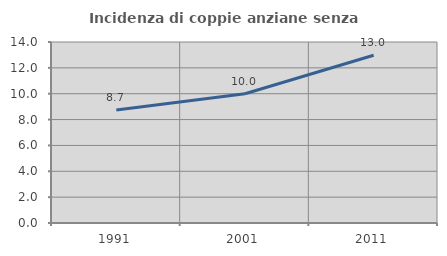
| Category | Incidenza di coppie anziane senza figli  |
|---|---|
| 1991.0 | 8.738 |
| 2001.0 | 10 |
| 2011.0 | 12.979 |